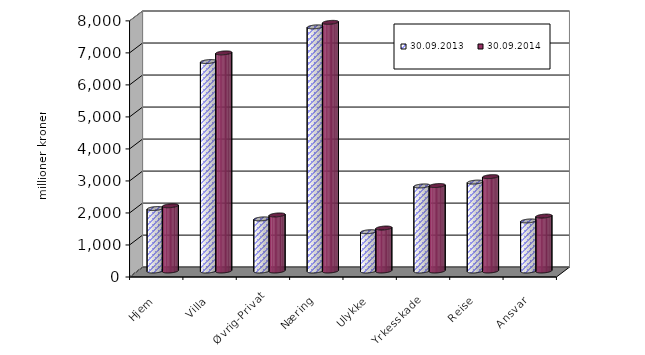
| Category | 30.09.2013 | 30.09.2014 |
|---|---|---|
| Hjem | 1950.638 | 2037.962 |
| Villa | 6541.909 | 6812.412 |
| Øvrig-Privat | 1627.973 | 1751.084 |
| Næring | 7625.695 | 7766.48 |
| Ulykke | 1227.156 | 1342.223 |
| Yrkesskade | 2657.396 | 2669.25 |
| Reise | 2777.051 | 2947.959 |
| Ansvar | 1563.493 | 1715.605 |